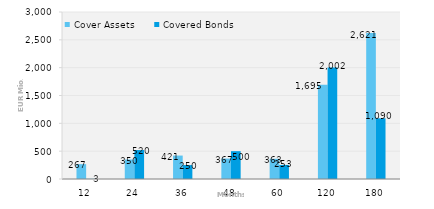
| Category | Cover Assets | Covered Bonds |
|---|---|---|
| 12.0 | 267 | 3 |
| 24.0 | 350 | 520 |
| 36.0 | 421 | 250 |
| 48.0 | 367 | 500 |
| 60.0 | 363 | 253 |
| 120.0 | 1695 | 2002 |
| 180.0 | 2621 | 1090 |